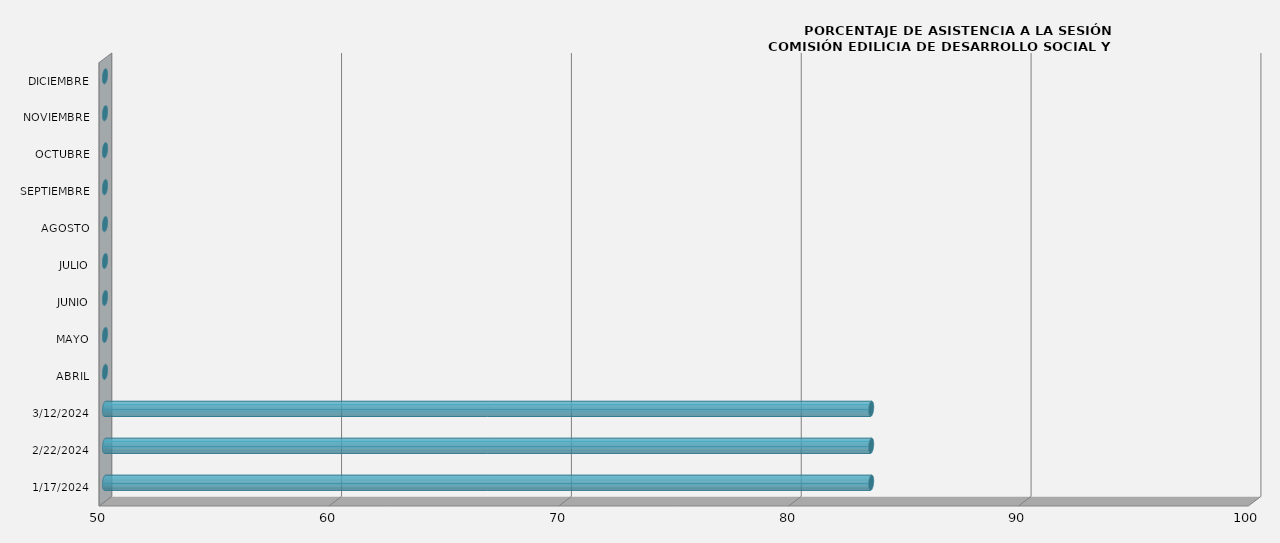
| Category | Series 0 |
|---|---|
| 17/01/2024 | 83.333 |
| 22/02/2024 | 83.333 |
| 12/03/2024 | 83.333 |
| ABRIL | 0 |
| MAYO | 0 |
| JUNIO | 0 |
| JULIO | 0 |
| AGOSTO | 0 |
| SEPTIEMBRE | 0 |
| OCTUBRE | 0 |
| NOVIEMBRE | 0 |
| DICIEMBRE | 0 |